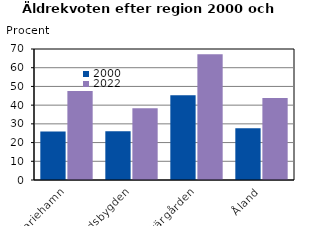
| Category | 2000 | 2022 |
|---|---|---|
| Mariehamn | 25.966 | 47.593 |
| Landsbygden | 26.071 | 38.403 |
| Skärgården | 45.282 | 67.253 |
| Åland | 27.61 | 43.752 |